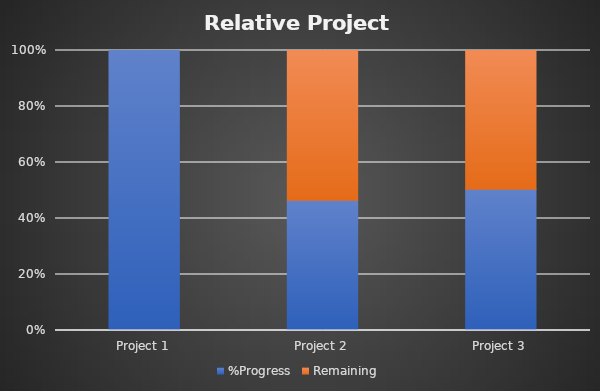
| Category | %Progress | Remaining |
|---|---|---|
| Project 1 | 1 | 0 |
| Project 2 | 0.465 | 0.535 |
| Project 3 | 0.505 | 0.495 |